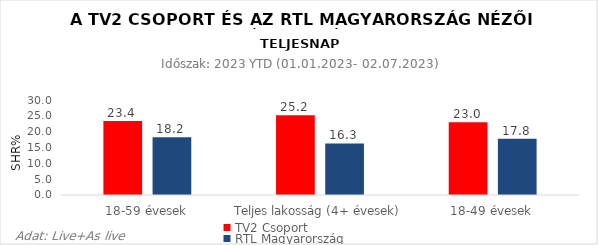
| Category | TV2 Csoport | RTL Magyarország |
|---|---|---|
| 18-59 évesek | 23.4 | 18.2 |
| Teljes lakosság (4+ évesek) | 25.2 | 16.3 |
| 18-49 évesek | 23 | 17.8 |